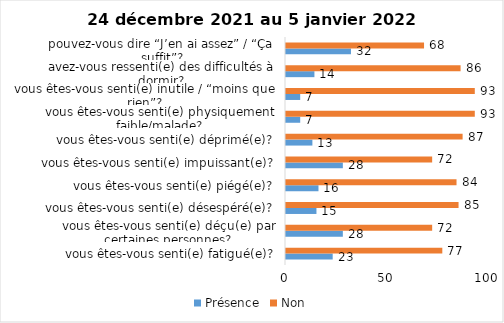
| Category | Présence | Non |
|---|---|---|
| vous êtes-vous senti(e) fatigué(e)? | 23 | 77 |
| vous êtes-vous senti(e) déçu(e) par certaines personnes? | 28 | 72 |
| vous êtes-vous senti(e) désespéré(e)? | 15 | 85 |
| vous êtes-vous senti(e) piégé(e)? | 16 | 84 |
| vous êtes-vous senti(e) impuissant(e)? | 28 | 72 |
| vous êtes-vous senti(e) déprimé(e)? | 13 | 87 |
| vous êtes-vous senti(e) physiquement faible/malade? | 7 | 93 |
| vous êtes-vous senti(e) inutile / “moins que rien”? | 7 | 93 |
| avez-vous ressenti(e) des difficultés à dormir? | 14 | 86 |
| pouvez-vous dire “J’en ai assez” / “Ça suffit”? | 32 | 68 |